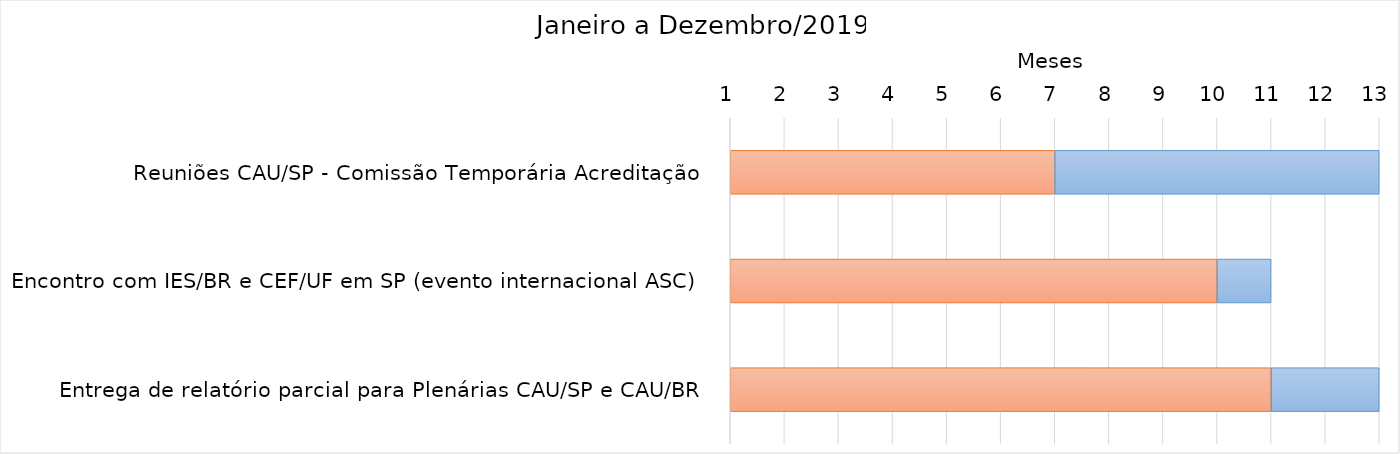
| Category | Início | Duração |
|---|---|---|
| Reuniões CAU/SP - Comissão Temporária Acreditação | 7 | 6 |
| Encontro com IES/BR e CEF/UF em SP (evento internacional ASC) | 10 | 1 |
| Entrega de relatório parcial para Plenárias CAU/SP e CAU/BR | 11 | 2 |